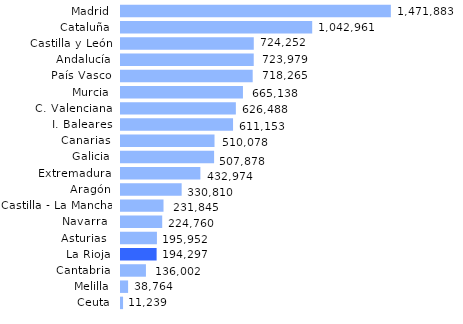
| Category | Series 0 |
|---|---|
| Ceuta | 11239.408 |
| Melilla | 38763.578 |
| Cantabria | 136001.675 |
| La Rioja | 194296.841 |
| Asturias  | 195952.189 |
| Navarra  | 224759.909 |
| Castilla - La Mancha | 231845.473 |
| Aragón | 330809.609 |
| Extremadura | 432974.409 |
| Galicia | 507878.297 |
| Canarias | 510078.47 |
| I. Baleares | 611153.115 |
| C. Valenciana | 626488.128 |
| Murcia | 665137.925 |
| País Vasco | 718265.16 |
| Andalucía | 723978.524 |
| Castilla y León | 724251.598 |
| Cataluña | 1042960.585 |
| Madrid | 1471883.273 |